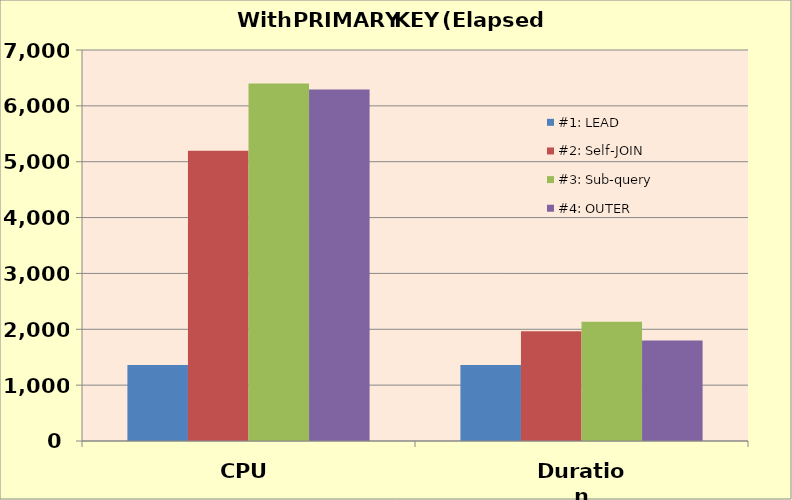
| Category | #1: LEAD | #2: Self-JOIN | #3: Sub-query | #4: OUTER APPLY |
|---|---|---|---|---|
| CPU | 1360.2 | 5194.2 | 6399.2 | 6293.4 |
| Duration | 1361.2 | 1965.6 | 2135.4 | 1800.6 |